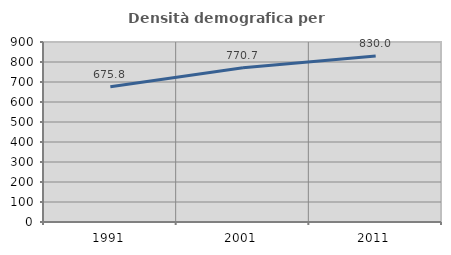
| Category | Densità demografica |
|---|---|
| 1991.0 | 675.758 |
| 2001.0 | 770.739 |
| 2011.0 | 829.993 |